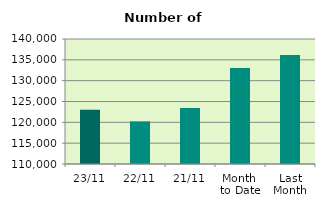
| Category | Series 0 |
|---|---|
| 23/11 | 122994 |
| 22/11 | 120228 |
| 21/11 | 123412 |
| Month 
to Date | 133060.118 |
| Last
Month | 136171.238 |